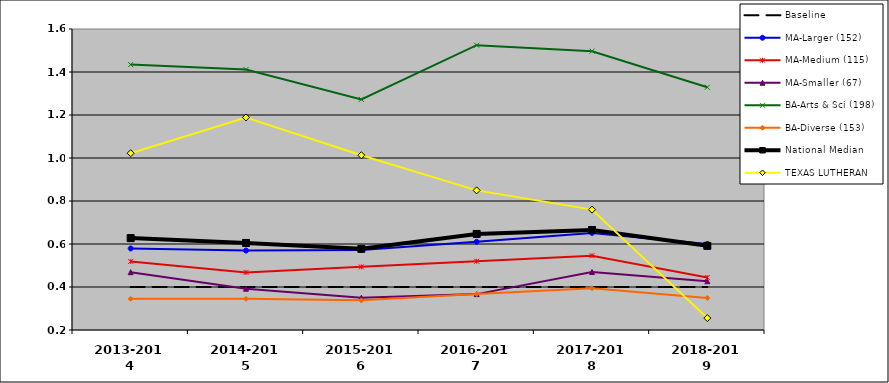
| Category | Baseline | MA-Larger (152) | MA-Medium (115) | MA-Smaller (67) | BA-Arts & Sci (198) | BA-Diverse (153) | National Median | TEXAS LUTHERAN |
|---|---|---|---|---|---|---|---|---|
| 2013-2014 | 0.4 | 0.579 | 0.519 | 0.469 | 1.434 | 0.345 | 0.627 | 1.022 |
| 2014-2015 | 0.4 | 0.57 | 0.468 | 0.392 | 1.411 | 0.345 | 0.605 | 1.189 |
| 2015-2016 | 0.4 | 0.573 | 0.494 | 0.35 | 1.273 | 0.338 | 0.577 | 1.013 |
| 2016-2017 | 0.4 | 0.61 | 0.52 | 0.367 | 1.525 | 0.367 | 0.647 | 0.849 |
| 2017-2018 | 0.4 | 0.652 | 0.546 | 0.47 | 1.497 | 0.394 | 0.665 | 0.76 |
| 2018-2019 | 0.4 | 0.6 | 0.444 | 0.427 | 1.329 | 0.349 | 0.591 | 0.255 |